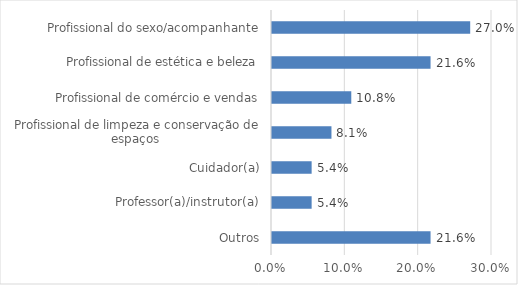
| Category | Series 0 |
|---|---|
| Outros | 0.216 |
| Professor(a)/instrutor(a) | 0.054 |
| Cuidador(a) | 0.054 |
| Profissional de limpeza e conservação de espaços  | 0.081 |
| Profissional de comércio e vendas | 0.108 |
| Profissional de estética e beleza | 0.216 |
| Profissional do sexo/acompanhante | 0.27 |